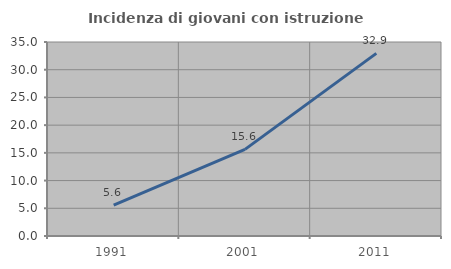
| Category | Incidenza di giovani con istruzione universitaria |
|---|---|
| 1991.0 | 5.556 |
| 2001.0 | 15.625 |
| 2011.0 | 32.941 |